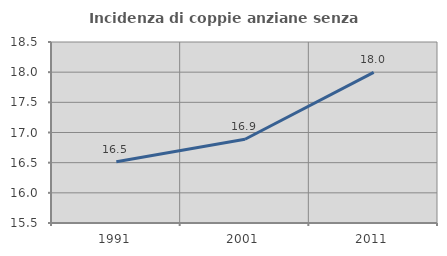
| Category | Incidenza di coppie anziane senza figli  |
|---|---|
| 1991.0 | 16.516 |
| 2001.0 | 16.887 |
| 2011.0 | 17.998 |